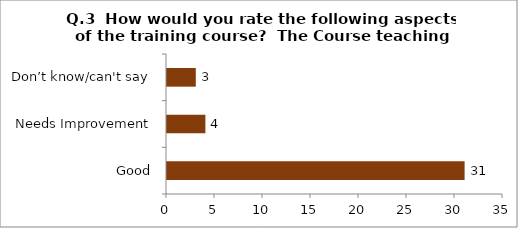
| Category | Q.3  How would you rate the following aspects of the training course?  |
|---|---|
| Good | 31 |
| Needs Improvement | 4 |
| Don’t know/can't say | 3 |